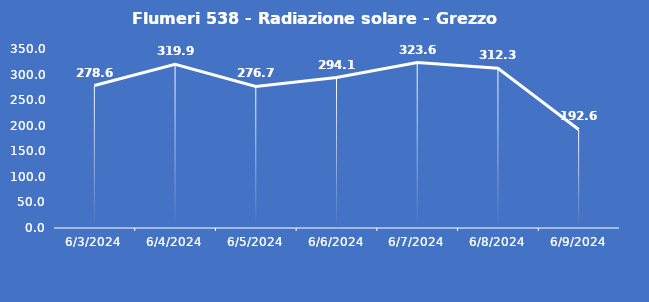
| Category | Flumeri 538 - Radiazione solare - Grezzo (W/m2) |
|---|---|
| 6/3/24 | 278.6 |
| 6/4/24 | 319.9 |
| 6/5/24 | 276.7 |
| 6/6/24 | 294.1 |
| 6/7/24 | 323.6 |
| 6/8/24 | 312.3 |
| 6/9/24 | 192.6 |